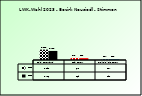
| Category | 2018 | 2023 |
|---|---|---|
| Bgld. Bauernbund | 3192 | 2786 |
| SPÖ Bauern | 645 | 569 |
| Freiheitliche Bauern | 234 | 191 |